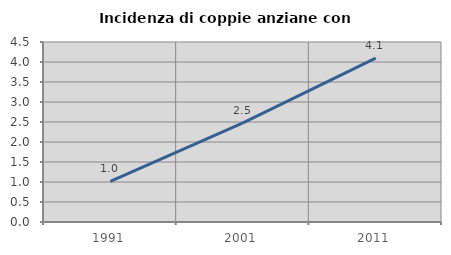
| Category | Incidenza di coppie anziane con figli |
|---|---|
| 1991.0 | 1.013 |
| 2001.0 | 2.48 |
| 2011.0 | 4.098 |